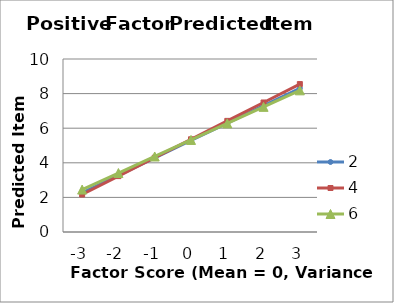
| Category | 2 | 4 | 6 |
|---|---|---|---|
| -3.0 | 2.268 | 2.167 | 2.453 |
| -2.0 | 3.275 | 3.231 | 3.409 |
| -1.0 | 4.282 | 4.295 | 4.365 |
| 0.0 | 5.289 | 5.359 | 5.321 |
| 1.0 | 6.296 | 6.423 | 6.277 |
| 2.0 | 7.303 | 7.487 | 7.233 |
| 3.0 | 8.31 | 8.551 | 8.189 |